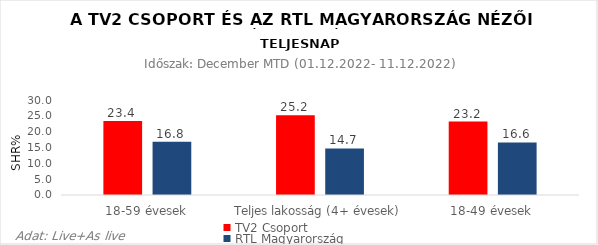
| Category | TV2 Csoport | RTL Magyarország |
|---|---|---|
| 18-59 évesek | 23.4 | 16.8 |
| Teljes lakosság (4+ évesek) | 25.2 | 14.7 |
| 18-49 évesek | 23.2 | 16.6 |